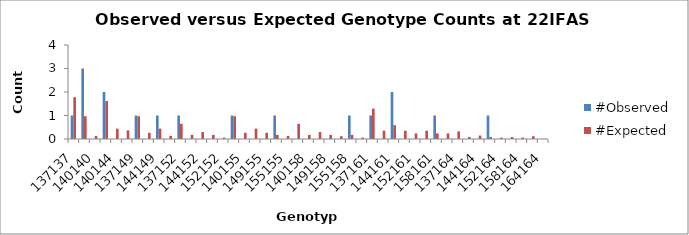
| Category | #Observed | #Expected |
|---|---|---|
| 137137.0 | 1 | 1.779 |
| 137140.0 | 3 | 0.971 |
| 140140.0 | 0 | 0.132 |
| 137144.0 | 2 | 1.618 |
| 140144.0 | 0 | 0.441 |
| 144144.0 | 0 | 0.368 |
| 137149.0 | 1 | 0.971 |
| 140149.0 | 0 | 0.265 |
| 144149.0 | 1 | 0.441 |
| 149149.0 | 0 | 0.132 |
| 137152.0 | 1 | 0.647 |
| 140152.0 | 0 | 0.176 |
| 144152.0 | 0 | 0.294 |
| 149152.0 | 0 | 0.176 |
| 152152.0 | 0 | 0.059 |
| 137155.0 | 1 | 0.971 |
| 140155.0 | 0 | 0.265 |
| 144155.0 | 0 | 0.441 |
| 149155.0 | 0 | 0.265 |
| 152155.0 | 1 | 0.176 |
| 155155.0 | 0 | 0.132 |
| 137158.0 | 0 | 0.647 |
| 140158.0 | 0 | 0.176 |
| 144158.0 | 0 | 0.294 |
| 149158.0 | 0 | 0.176 |
| 152158.0 | 0 | 0.118 |
| 155158.0 | 1 | 0.176 |
| 158158.0 | 0 | 0.059 |
| 137161.0 | 1 | 1.294 |
| 140161.0 | 0 | 0.353 |
| 144161.0 | 2 | 0.588 |
| 149161.0 | 0 | 0.353 |
| 152161.0 | 0 | 0.235 |
| 155161.0 | 0 | 0.353 |
| 158161.0 | 1 | 0.235 |
| 161161.0 | 0 | 0.235 |
| 137164.0 | 0 | 0.324 |
| 140164.0 | 0 | 0.088 |
| 144164.0 | 0 | 0.147 |
| 149164.0 | 1 | 0.088 |
| 152164.0 | 0 | 0.059 |
| 155164.0 | 0 | 0.088 |
| 158164.0 | 0 | 0.059 |
| 161164.0 | 0 | 0.118 |
| 164164.0 | 0 | 0.015 |